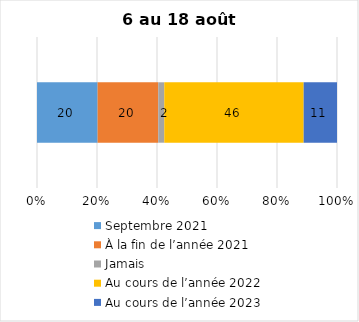
| Category | Septembre 2021 | À la fin de l’année 2021 | Jamais | Au cours de l’année 2022 | Au cours de l’année 2023 |
|---|---|---|---|---|---|
| 0 | 20 | 20 | 2 | 46 | 11 |